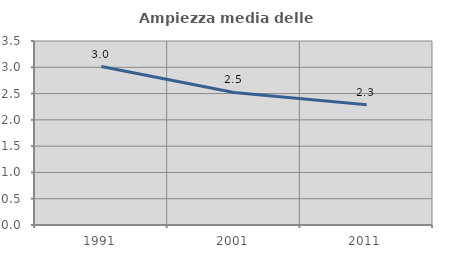
| Category | Ampiezza media delle famiglie |
|---|---|
| 1991.0 | 3.013 |
| 2001.0 | 2.522 |
| 2011.0 | 2.288 |